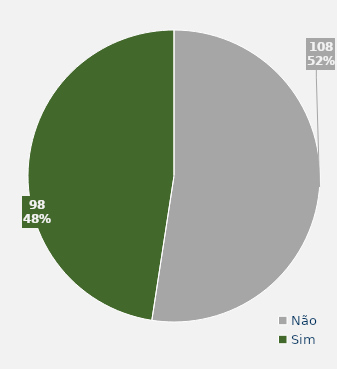
| Category | Total |
|---|---|
| Não | 108 |
| Sim | 98 |